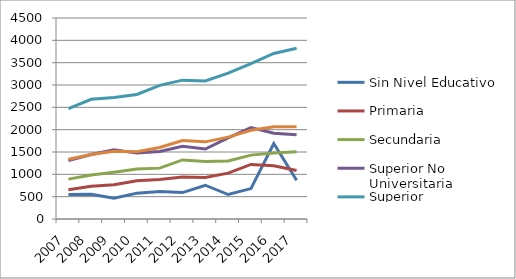
| Category | Sin Nivel Educativo | Primaria | Secundaria | Superior No Universitaria | Superior Universitaria | General |
|---|---|---|---|---|---|---|
| 2007.0 | 548 | 653 | 893 | 1308 | 2472 | 1338 |
| 2008.0 | 556 | 733 | 984 | 1445 | 2681 | 1444 |
| 2009.0 | 467 | 767 | 1047 | 1551 | 2720 | 1514 |
| 2010.0 | 579 | 857 | 1120 | 1475 | 2787 | 1505 |
| 2011.0 | 613 | 883 | 1139 | 1510 | 2993 | 1600 |
| 2012.0 | 591 | 939 | 1322 | 1628 | 3109 | 1758 |
| 2013.0 | 756 | 927 | 1285 | 1566 | 3092 | 1727 |
| 2014.0 | 548 | 1027 | 1298 | 1815 | 3265 | 1833 |
| 2015.0 | 681 | 1221 | 1430 | 2045 | 3476 | 1985 |
| 2016.0 | 1689 | 1194 | 1479 | 1920 | 3706 | 2066 |
| 2017.0 | 868 | 1086 | 1507 | 1885 | 3821 | 2068 |